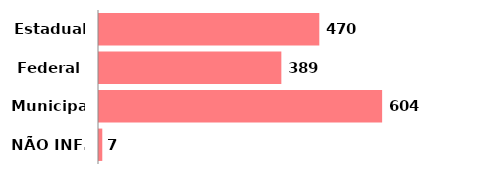
| Category | Qtde |
|---|---|
| Estadual | 470 |
| Federal | 389 |
| Municipal | 604 |
| NÃO INF. | 7 |